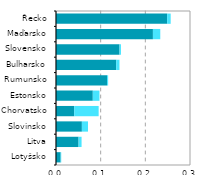
| Category |  ICT služby |  ICT zpracovatelský průmysl |
|---|---|---|
| Lotyšsko | 0.01 | 0.001 |
| Litva | 0.051 | 0.007 |
| Slovinsko | 0.058 | 0.014 |
| Chorvatsko | 0.041 | 0.055 |
| Estonsko | 0.082 | 0.015 |
| Rumunsko | 0.114 | 0.002 |
| Bulharsko | 0.135 | 0.007 |
| Slovensko | 0.142 | 0.003 |
| Maďarsko | 0.217 | 0.016 |
| Řecko | 0.249 | 0.008 |